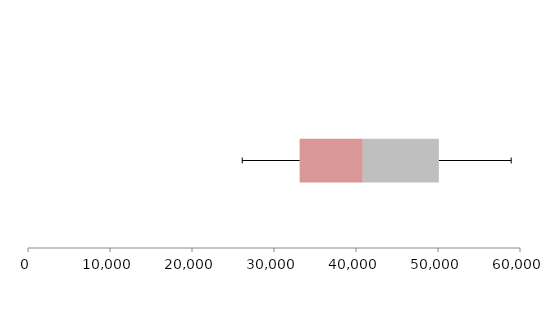
| Category | Series 1 | Series 2 | Series 3 |
|---|---|---|---|
| 0 | 33126.086 | 7703.683 | 9275.169 |